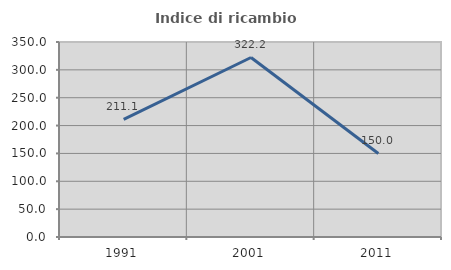
| Category | Indice di ricambio occupazionale  |
|---|---|
| 1991.0 | 211.111 |
| 2001.0 | 322.222 |
| 2011.0 | 150 |